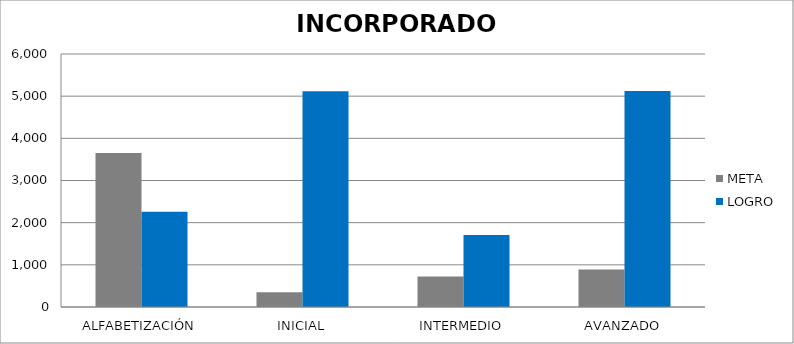
| Category | META | LOGRO |
|---|---|---|
| ALFABETIZACIÓN | 3655 | 2261 |
| INICIAL | 348 | 5119 |
| INTERMEDIO | 724 | 1706 |
| AVANZADO | 887 | 5123 |